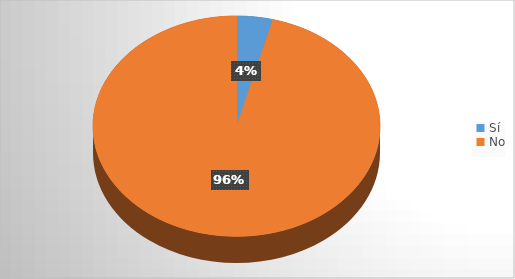
| Category | Series 0 |
|---|---|
| Sí | 3 |
| No | 71 |